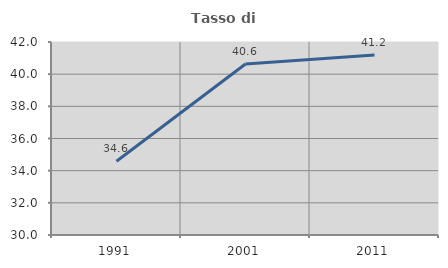
| Category | Tasso di occupazione   |
|---|---|
| 1991.0 | 34.582 |
| 2001.0 | 40.634 |
| 2011.0 | 41.198 |